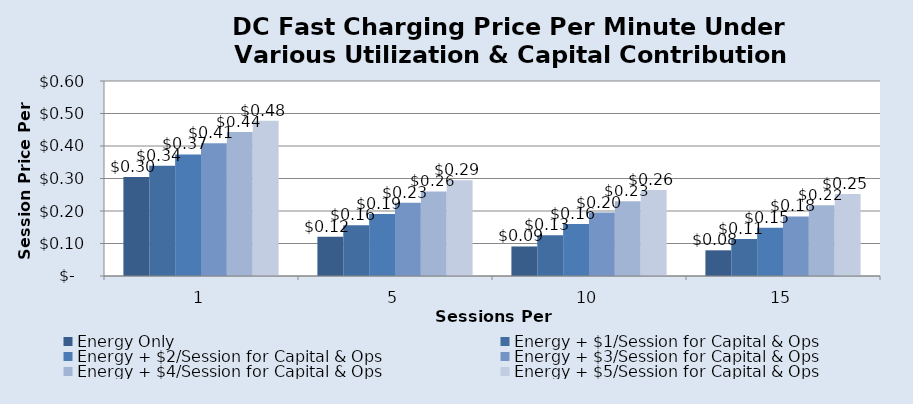
| Category | Energy Only | Energy + $1/Session for Capital & Ops | Energy + $2/Session for Capital & Ops | Energy + $3/Session for Capital & Ops | Energy + $4/Session for Capital & Ops | Energy + $5/Session for Capital & Ops |
|---|---|---|---|---|---|---|
| 1.0 | 0.304 | 0.339 | 0.374 | 0.409 | 0.443 | 0.478 |
| 5.0 | 0.121 | 0.156 | 0.191 | 0.225 | 0.26 | 0.295 |
| 10.0 | 0.091 | 0.126 | 0.16 | 0.195 | 0.23 | 0.265 |
| 15.0 | 0.079 | 0.114 | 0.148 | 0.183 | 0.218 | 0.253 |